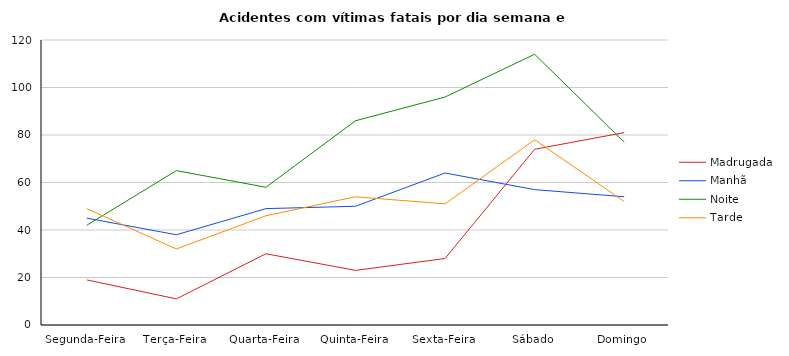
| Category | Madrugada | Manhã | Noite | Tarde |
|---|---|---|---|---|
| Segunda-Feira | 19 | 45 | 42 | 49 |
| Terça-Feira | 11 | 38 | 65 | 32 |
| Quarta-Feira | 30 | 49 | 58 | 46 |
| Quinta-Feira | 23 | 50 | 86 | 54 |
| Sexta-Feira | 28 | 64 | 96 | 51 |
| Sábado | 74 | 57 | 114 | 78 |
| Domingo | 81 | 54 | 77 | 52 |